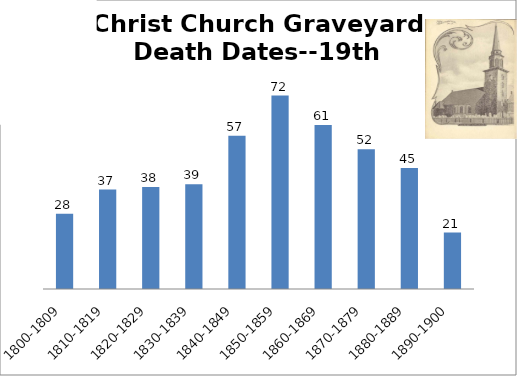
| Category | Series 0 |
|---|---|
| 1800-1809 | 28 |
| 1810-1819 | 37 |
| 1820-1829 | 38 |
| 1830-1839 | 39 |
| 1840-1849 | 57 |
| 1850-1859 | 72 |
| 1860-1869 | 61 |
| 1870-1879 | 52 |
| 1880-1889 | 45 |
| 1890-1900 | 21 |